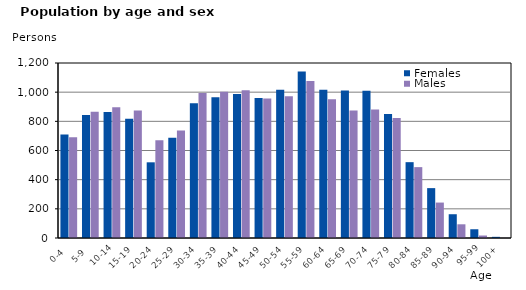
| Category | Females | Males |
|---|---|---|
|   0-4  | 710 | 691 |
|   5-9  | 844 | 865 |
| 10-14 | 864 | 897 |
| 15-19  | 817 | 874 |
| 20-24  | 519 | 670 |
| 25-29  | 688 | 737 |
| 30-34  | 924 | 995 |
| 35-39  | 966 | 1003 |
| 40-44  | 988 | 1014 |
| 45-49  | 960 | 957 |
| 50-54  | 1017 | 972 |
| 55-59  | 1142 | 1076 |
| 60-64  | 1016 | 951 |
| 65-69  | 1011 | 874 |
| 70-74  | 1010 | 882 |
| 75-79  | 850 | 823 |
| 80-84  | 520 | 486 |
| 85-89  | 342 | 243 |
| 90-94  | 163 | 94 |
| 95-99 | 60 | 17 |
| 100+ | 8 | 1 |